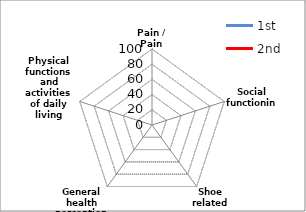
| Category | 1st | 2nd |
|---|---|---|
| Pain / Pain related | 0 | 0 |
| Social functioning | 0 | 0 |
| Shoe related | 0 | 0 |
| General health perceptions | 0 | 0 |
| Physical functions and activities of daily living (ADL) | 0 | 0 |